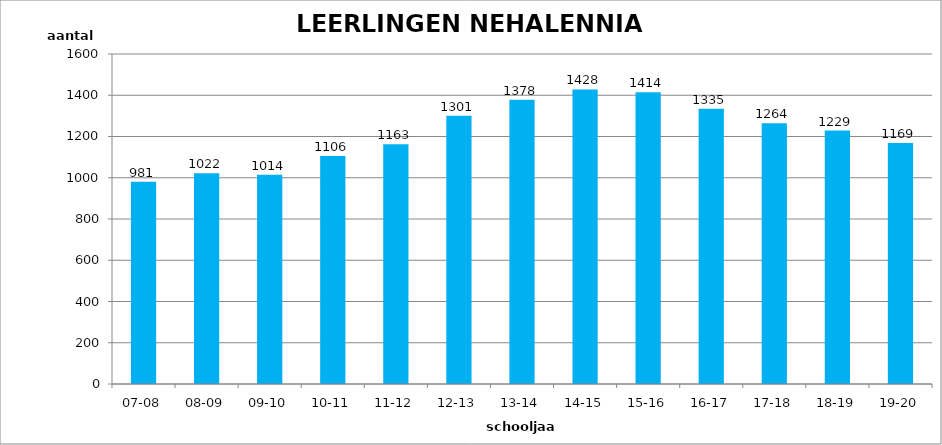
| Category | Series 0 |
|---|---|
| 07-08 | 981 |
| 08-09 | 1022 |
| 09-10 | 1014 |
| 10-11 | 1106 |
| 11-12 | 1163 |
| 12-13 | 1301 |
| 13-14 | 1378 |
| 14-15 | 1428 |
| 15-16 | 1414 |
| 16-17 | 1335 |
| 17-18 | 1264 |
| 18-19 | 1229 |
| 19-20 | 1169 |